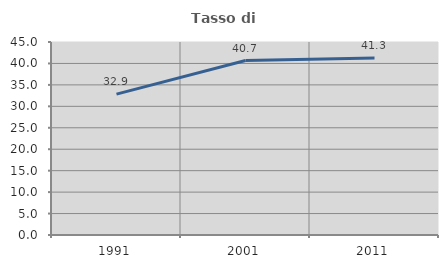
| Category | Tasso di occupazione   |
|---|---|
| 1991.0 | 32.853 |
| 2001.0 | 40.674 |
| 2011.0 | 41.278 |